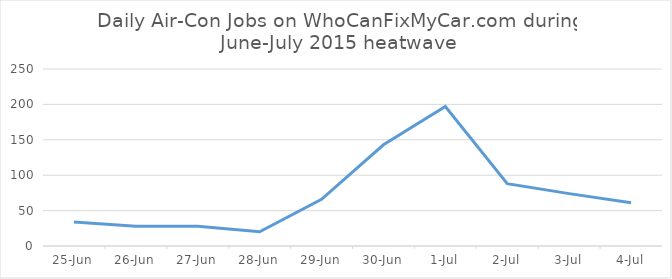
| Category | Daily Air-Con Jobs |
|---|---|
| 2015-06-25 | 34 |
| 2015-06-26 | 28 |
| 2015-06-27 | 28 |
| 2015-06-28 | 20 |
| 2015-06-29 | 66 |
| 2015-06-30 | 143 |
| 2015-07-01 | 197 |
| 2015-07-02 | 88 |
| 2015-07-03 | 74 |
| 2015-07-04 | 61 |